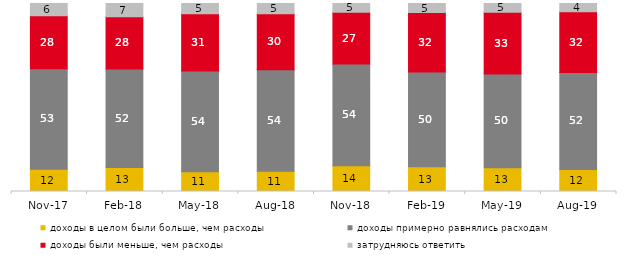
| Category | доходы в целом были больше, чем расходы | доходы примерно равнялись расходам | доходы были меньше, чем расходы | затрудняюсь ответить |
|---|---|---|---|---|
| 2017-11-01 | 11.85 | 53.45 | 28.25 | 6.45 |
| 2018-02-01 | 12.75 | 52.3 | 27.75 | 7 |
| 2018-05-01 | 10.55 | 53.5 | 30.5 | 5.45 |
| 2018-08-01 | 10.75 | 54.05 | 29.8 | 5.4 |
| 2018-11-01 | 13.723 | 54.092 | 27.495 | 4.691 |
| 2019-02-01 | 13.1 | 50.4 | 31.65 | 4.85 |
| 2019-05-01 | 12.63 | 49.926 | 32.739 | 4.705 |
| 2019-08-01 | 11.688 | 51.648 | 32.218 | 4.446 |